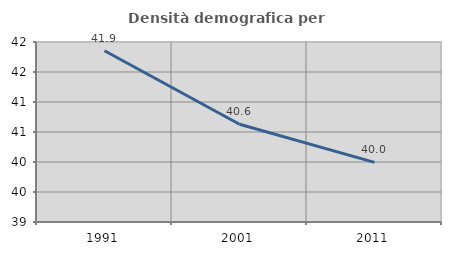
| Category | Densità demografica |
|---|---|
| 1991.0 | 41.854 |
| 2001.0 | 40.629 |
| 2011.0 | 39.994 |